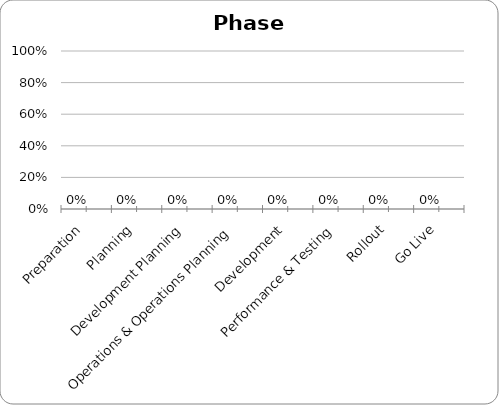
| Category | Series 0 | Series 1 |
|---|---|---|
| Preparation | 0 | 0 |
| Planning | 0 | 0 |
| Development Planning | 0 | 0 |
| Operations & Operations Planning | 0 | 0 |
| Development | 0 | 0 |
| Performance & Testing | 0 | 0 |
| Rollout | 0 | 0 |
| Go Live | 0 | 0 |